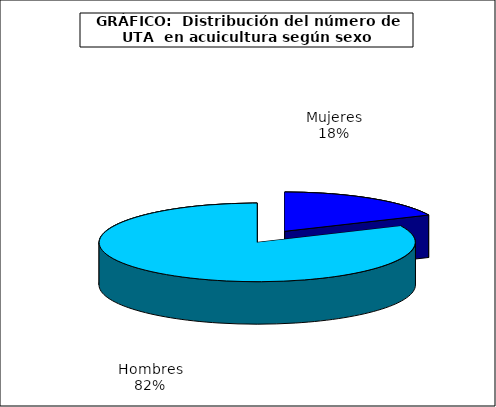
| Category | UTA | Series 1 |
|---|---|---|
| 0 | 1222.544 |  |
| 1 | 5497.46 |  |